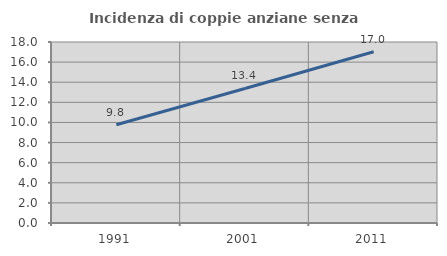
| Category | Incidenza di coppie anziane senza figli  |
|---|---|
| 1991.0 | 9.773 |
| 2001.0 | 13.38 |
| 2011.0 | 17.027 |